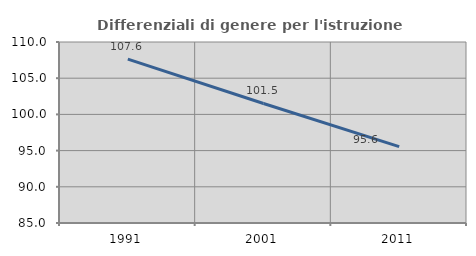
| Category | Differenziali di genere per l'istruzione superiore |
|---|---|
| 1991.0 | 107.628 |
| 2001.0 | 101.511 |
| 2011.0 | 95.554 |